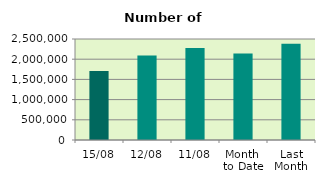
| Category | Series 0 |
|---|---|
| 15/08 | 1708130 |
| 12/08 | 2094642 |
| 11/08 | 2279336 |
| Month 
to Date | 2139526.182 |
| Last
Month | 2380266.19 |